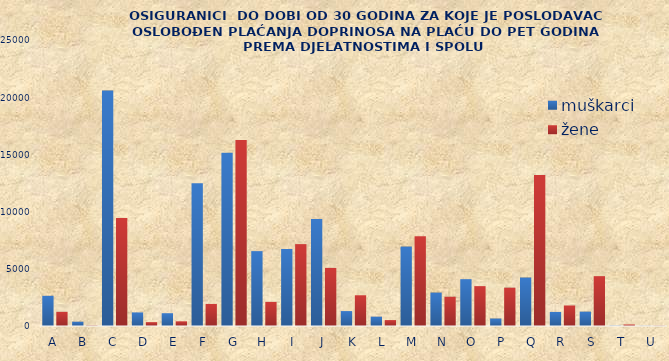
| Category | muškarci | žene |
|---|---|---|
| A | 2639 | 1239 |
| B | 376 | 37 |
| C | 20579 | 9435 |
| D | 1187 | 337 |
| E | 1118 | 409 |
| F | 12472 | 1928 |
| G | 15143 | 16268 |
| H | 6544 | 2110 |
| I | 6732 | 7157 |
| J | 9353 | 5077 |
| K | 1304 | 2687 |
| L | 817 | 517 |
| M | 6944 | 7835 |
| N | 2922 | 2560 |
| O | 4093 | 3485 |
| P | 654 | 3351 |
| Q | 4237 | 13199 |
| R | 1229 | 1793 |
| S | 1255 | 4357 |
| T | 28 | 133 |
| U | 14 | 21 |